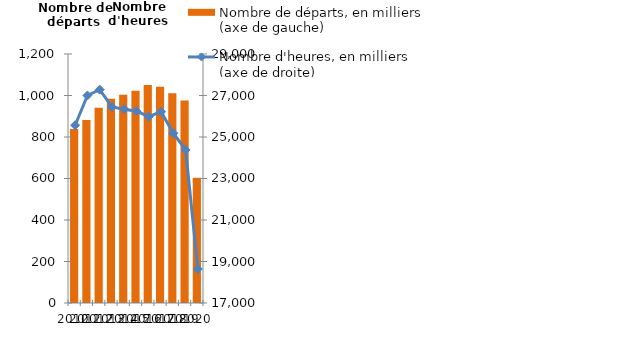
| Category | Nombre de départs, en milliers 
(axe de gauche) |
|---|---|
| 2010.0 | 838.642 |
| 2011.0 | 882.318 |
| 2012.0 | 941.368 |
| 2013.0 | 983.932 |
| 2014.0 | 1004.207 |
| 2015.0 | 1023 |
| 2016.0 | 1050.4 |
| 2017.0 | 1042.3 |
| 2018.0 | 1010.57 |
| 2019.0 | 975.969 |
| 2020.0 | 603.423 |